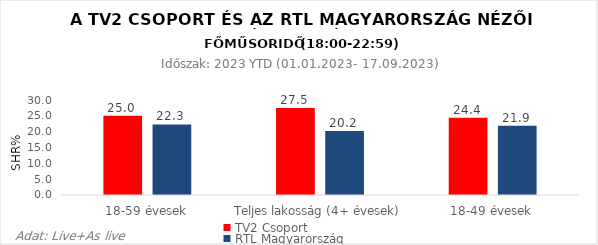
| Category | TV2 Csoport | RTL Magyarország |
|---|---|---|
| 18-59 évesek | 25 | 22.3 |
| Teljes lakosság (4+ évesek) | 27.5 | 20.2 |
| 18-49 évesek | 24.4 | 21.9 |